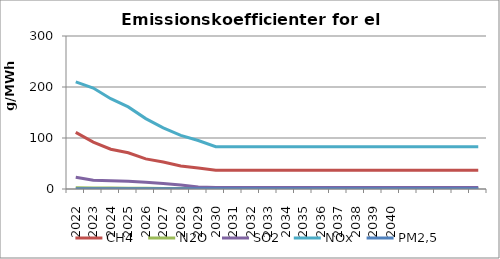
| Category | CH4 | N2O | SO2 | NOx | PM2,5 |
|---|---|---|---|---|---|
| 2022.0 | 111 | 2.3 | 23 | 210 | 0.6 |
| 2023.0 | 92 | 2.1 | 17 | 198 | 0.5 |
| 2024.0 | 78 | 1.9 | 16 | 177 | 0.5 |
| 2025.0 | 71 | 1.7 | 15 | 161 | 0.5 |
| 2026.0 | 59 | 1.4 | 13 | 138 | 0.4 |
| 2027.0 | 53 | 1.2 | 11 | 120 | 0.4 |
| 2028.0 | 45 | 1.1 | 8 | 105 | 0.4 |
| 2029.0 | 41 | 1 | 4 | 95 | 0.3 |
| 2030.0 | 37 | 0.8 | 3 | 83 | 0.3 |
| 2031.0 | 37 | 0.8 | 3 | 83 | 0.3 |
| 2032.0 | 37 | 0.8 | 3 | 83 | 0.3 |
| 2033.0 | 37 | 0.8 | 3 | 83 | 0.3 |
| 2034.0 | 37 | 0.8 | 3 | 83 | 0.3 |
| 2035.0 | 37 | 0.8 | 3 | 83 | 0.3 |
| 2036.0 | 37 | 0.8 | 3 | 83 | 0.3 |
| 2037.0 | 37 | 0.8 | 3 | 83 | 0.3 |
| 2038.0 | 37 | 0.8 | 3 | 83 | 0.3 |
| 2039.0 | 37 | 0.8 | 3 | 83 | 0.3 |
| 2040.0 | 37 | 0.8 | 3 | 83 | 0.3 |